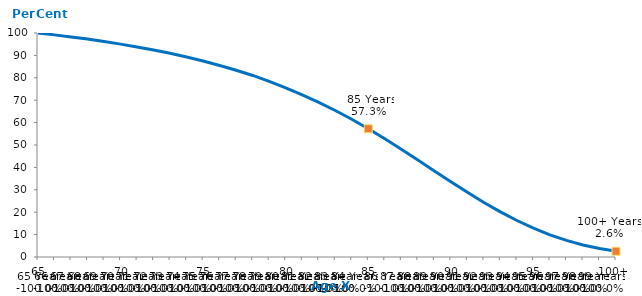
| Category | Resident aged 65 years in 2023 |
|---|---|
|  65 | 100 |
|  66 | 99.166 |
|  67 | 98.263 |
|  68 | 97.281 |
|  69 | 96.208 |
|  70 | 95.04 |
|  71 | 93.778 |
|  72 | 92.419 |
|  73 | 90.937 |
|  74 | 89.299 |
|  75 | 87.492 |
|  76 | 85.524 |
|  77 | 83.391 |
|  78 | 81.05 |
|  79 | 78.441 |
|  80 | 75.549 |
|  81 | 72.402 |
|  82 | 69.029 |
|  83 | 65.413 |
|  84 | 61.502 |
|  85 | 57.273 |
|  86 | 52.796 |
|  87 | 48.121 |
|  88 | 43.312 |
|  89 | 38.445 |
|  90 | 33.603 |
|  91 | 28.879 |
|  92 | 24.363 |
|  93 | 20.14 |
|  94 | 16.287 |
|  95 | 12.859 |
|  96 | 9.893 |
|  97 | 7.402 |
|  98 | 5.374 |
|  99 | 3.778 |
| 100+ | 2.567 |